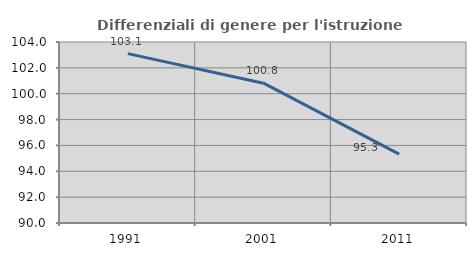
| Category | Differenziali di genere per l'istruzione superiore |
|---|---|
| 1991.0 | 103.098 |
| 2001.0 | 100.816 |
| 2011.0 | 95.323 |